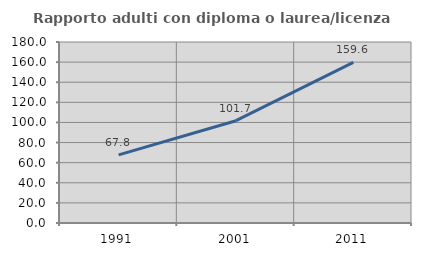
| Category | Rapporto adulti con diploma o laurea/licenza media  |
|---|---|
| 1991.0 | 67.793 |
| 2001.0 | 101.739 |
| 2011.0 | 159.649 |